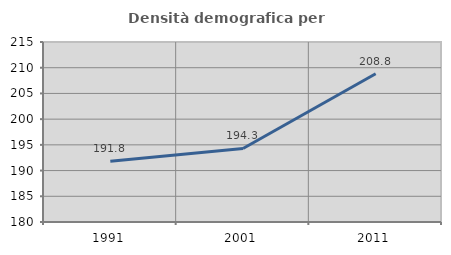
| Category | Densità demografica |
|---|---|
| 1991.0 | 191.822 |
| 2001.0 | 194.295 |
| 2011.0 | 208.835 |